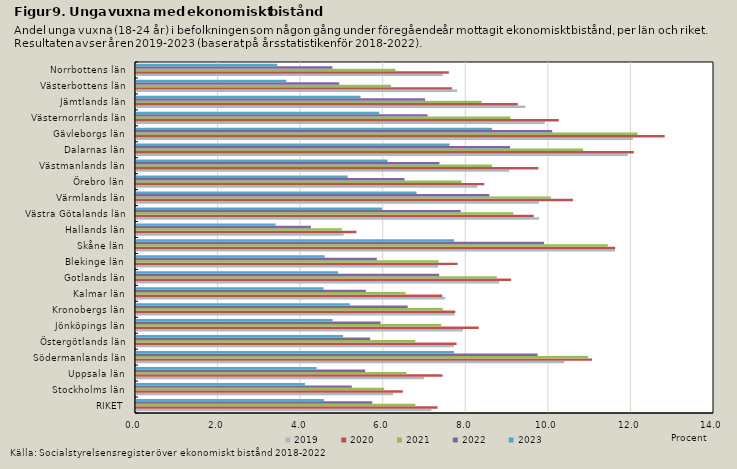
| Category | 2019 | 2020 | 2021 | 2022 | 2023 |
|---|---|---|---|---|---|
| RIKET | 7.157 | 7.304 | 6.765 | 5.722 | 4.549 |
| Stockholms län | 6.227 | 6.464 | 6.011 | 5.227 | 4.093 |
| Uppsala län | 6.973 | 7.425 | 6.551 | 5.549 | 4.374 |
| Södermanlands län | 10.373 | 11.048 | 10.949 | 9.727 | 7.7 |
| Östergötlands län | 7.703 | 7.765 | 6.763 | 5.672 | 5.014 |
| Jönköpings län | 7.919 | 8.301 | 7.391 | 5.925 | 4.762 |
| Kronobergs län | 7.719 | 7.734 | 7.433 | 6.582 | 5.176 |
| Kalmar län | 7.489 | 7.42 | 6.529 | 5.567 | 4.541 |
| Gotlands län | 8.798 | 9.085 | 8.741 | 7.343 | 4.895 |
| Blekinge län | 7.32 | 7.79 | 7.331 | 5.833 | 4.569 |
| Skåne län | 11.6 | 11.606 | 11.429 | 9.885 | 7.702 |
| Hallands län | 5.03 | 5.34 | 4.986 | 4.236 | 3.382 |
| Västra Götalands län | 9.765 | 9.632 | 9.142 | 7.865 | 5.958 |
| Värmlands län | 9.761 | 10.582 | 10.054 | 8.558 | 6.794 |
| Örebro län | 8.268 | 8.435 | 7.884 | 6.503 | 5.127 |
| Västmanlands län | 9.039 | 9.747 | 8.623 | 7.35 | 6.093 |
| Dalarnas län | 11.911 | 12.057 | 10.829 | 9.059 | 7.595 |
| Gävleborgs län | 12.036 | 12.806 | 12.147 | 10.08 | 8.624 |
| Västernorrlands län | 9.9 | 10.24 | 9.072 | 7.062 | 5.892 |
| Jämtlands län | 9.431 | 9.246 | 8.372 | 7.002 | 5.439 |
| Västerbottens län | 7.784 | 7.651 | 6.178 | 4.923 | 3.637 |
| Norrbottens län | 7.434 | 7.579 | 6.285 | 4.757 | 3.419 |